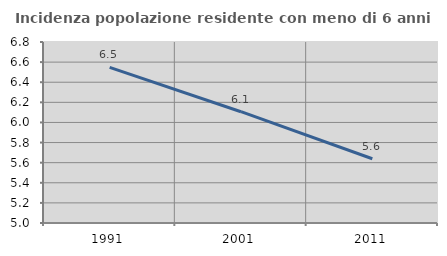
| Category | Incidenza popolazione residente con meno di 6 anni |
|---|---|
| 1991.0 | 6.547 |
| 2001.0 | 6.107 |
| 2011.0 | 5.639 |